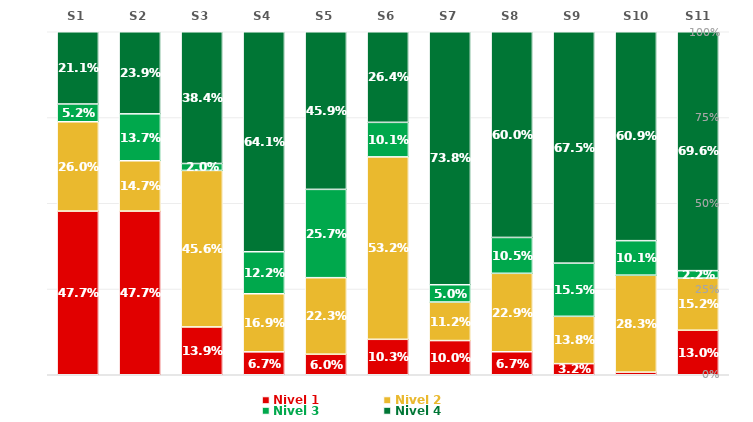
| Category | Nivel 1 | Nivel 2 | Nivel 3 | Nivel 4 |
|---|---|---|---|---|
| S1 | 0.477 | 0.26 | 0.052 | 0.211 |
| S2 | 0.477 | 0.147 | 0.137 | 0.239 |
| S3 | 0.139 | 0.456 | 0.02 | 0.384 |
| S4 | 0.067 | 0.169 | 0.122 | 0.641 |
| S5 | 0.06 | 0.223 | 0.257 | 0.459 |
| S6 | 0.103 | 0.532 | 0.101 | 0.264 |
| S7 | 0.1 | 0.112 | 0.05 | 0.738 |
| S8 | 0.067 | 0.229 | 0.105 | 0.6 |
| S9 | 0.032 | 0.138 | 0.155 | 0.675 |
| S10 | 0.008 | 0.283 | 0.101 | 0.609 |
| S11 | 0.13 | 0.152 | 0.022 | 0.696 |